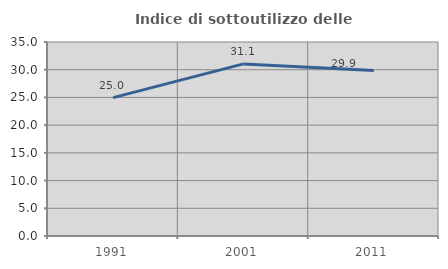
| Category | Indice di sottoutilizzo delle abitazioni  |
|---|---|
| 1991.0 | 24.969 |
| 2001.0 | 31.051 |
| 2011.0 | 29.872 |